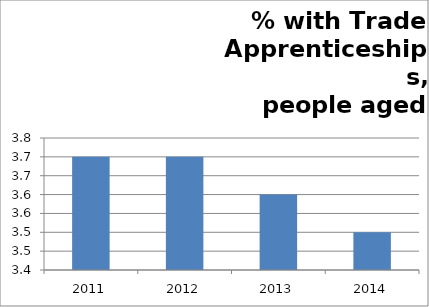
| Category | % with Trade Apprenticeships - aged 16-64 |
|---|---|
| 2011.0 | 3.7 |
| 2012.0 | 3.7 |
| 2013.0 | 3.6 |
| 2014.0 | 3.5 |